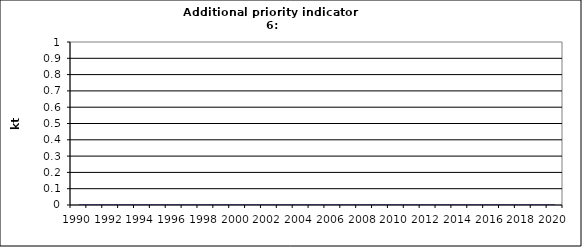
| Category | Cement production, kt |
|---|---|
| 1990 | 0 |
| 1991 | 0 |
| 1992 | 0 |
| 1993 | 0 |
| 1994 | 0 |
| 1995 | 0 |
| 1996 | 0 |
| 1997 | 0 |
| 1998 | 0 |
| 1999 | 0 |
| 2000 | 0 |
| 2001 | 0 |
| 2002 | 0 |
| 2003 | 0 |
| 2004 | 0 |
| 2005 | 0 |
| 2006 | 0 |
| 2007 | 0 |
| 2008 | 0 |
| 2009 | 0 |
| 2010 | 0 |
| 2011 | 0 |
| 2012 | 0 |
| 2013 | 0 |
| 2014 | 0 |
| 2015 | 0 |
| 2016 | 0 |
| 2017 | 0 |
| 2018 | 0 |
| 2019 | 0 |
| 2020 | 0 |